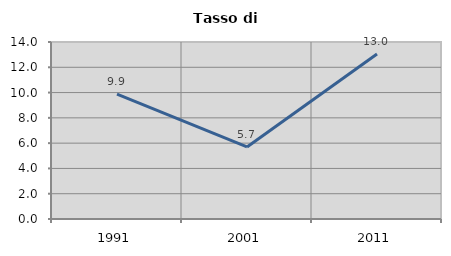
| Category | Tasso di disoccupazione   |
|---|---|
| 1991.0 | 9.884 |
| 2001.0 | 5.699 |
| 2011.0 | 13.043 |